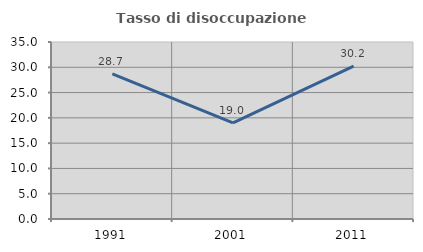
| Category | Tasso di disoccupazione giovanile  |
|---|---|
| 1991.0 | 28.676 |
| 2001.0 | 19.003 |
| 2011.0 | 30.208 |